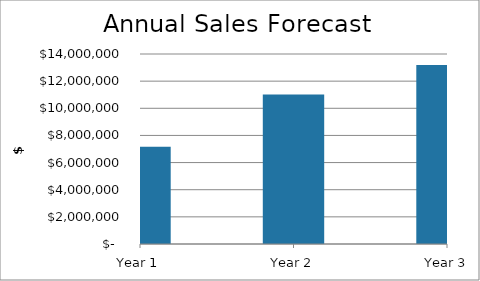
| Category | Total Sales |
|---|---|
| Year 1 | 7170223.823 |
| Year 2 | 11019460.033 |
| Year 3 | 13184972.252 |